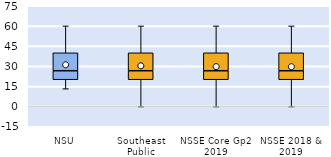
| Category | 25th | 50th | 75th |
|---|---|---|---|
| NSU | 20 | 6.667 | 13.333 |
| Southeast Public | 20 | 6.667 | 13.333 |
| NSSE Core Gp2 2019 | 20 | 6.667 | 13.333 |
| NSSE 2018 & 2019 | 20 | 6.667 | 13.333 |